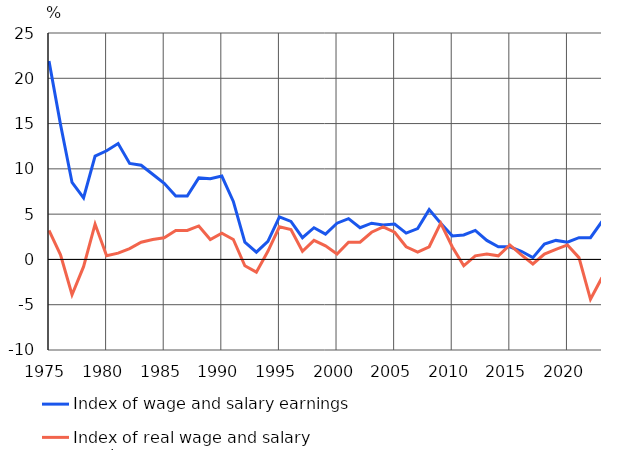
| Category | Index of wage and salary earnings | Index of real wage and salary earnings |
|---|---|---|
| 1975 | 21.9 | 3.2 |
| 1976 | 14.9 | 0.5 |
| 1977 | 8.5 | -3.9 |
| 1978 | 6.8 | -0.8 |
| 1979 | 11.4 | 3.9 |
| 1980 | 12 | 0.4 |
| 1981 | 12.8 | 0.7 |
| 1982 | 10.6 | 1.2 |
| 1983 | 10.4 | 1.9 |
| 1984 | 9.4 | 2.2 |
| 1985 | 8.4 | 2.4 |
| 1986 | 7 | 3.2 |
| 1987 | 7 | 3.2 |
| 1988 | 9 | 3.7 |
| 1989 | 8.9 | 2.2 |
| 1990 | 9.2 | 2.9 |
| 1991 | 6.4 | 2.2 |
| 1992 | 1.9 | -0.7 |
| 1993 | 0.8 | -1.4 |
| 1994 | 2 | 0.9 |
| 1995 | 4.7 | 3.6 |
| 1996 | 4.2 | 3.3 |
| 1997 | 2.4 | 0.9 |
| 1998 | 3.5 | 2.1 |
| 1999 | 2.8 | 1.5 |
| 2000 | 4 | 0.6 |
| 2001 | 4.5 | 1.9 |
| 2002 | 3.5 | 1.9 |
| 2003 | 4 | 3 |
| 2004 | 3.8 | 3.6 |
| 2005 | 3.9 | 3 |
| 2006 | 2.9 | 1.4 |
| 2007 | 3.4 | 0.8 |
| 2008 | 5.5 | 1.4 |
| 2009 | 4 | 4 |
| 2010 | 2.6 | 1.4 |
| 2011 | 2.7 | -0.7 |
| 2012 | 3.2 | 0.4 |
| 2013 | 2.1 | 0.6 |
| 2014 | 1.4 | 0.4 |
| 2015 | 1.4 | 1.6 |
| 2016 | 0.9 | 0.5 |
| 2017 | 0.2 | -0.5 |
| 2018 | 1.7 | 0.6 |
| 2019 | 2.1 | 1.1 |
| 2020 | 1.9 | 1.6 |
| 2021 | 2.4 | 0.2 |
| 2022 | 2.4 | -4.4 |
| 2023* | 4.2 | -2 |